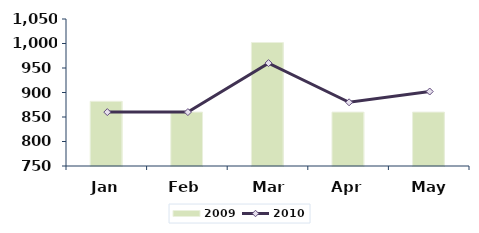
| Category | 2009 |
|---|---|
| Jan | 882 |
| Feb | 860 |
| Mar | 1002 |
| Apr | 860 |
| May | 860 |